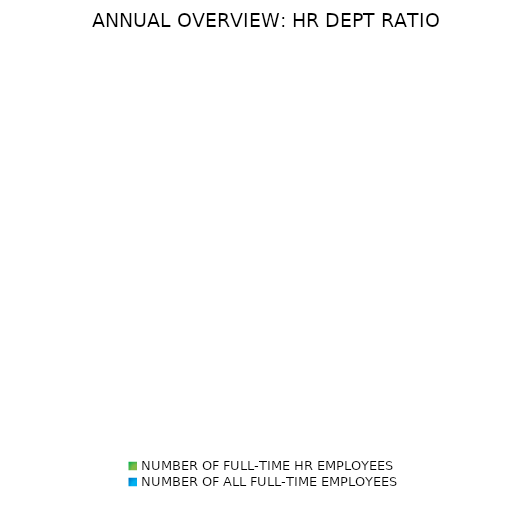
| Category | FY AVG |
|---|---|
| NUMBER OF FULL-TIME HR EMPLOYEES | 0 |
| NUMBER OF ALL FULL-TIME EMPLOYEES | 0 |